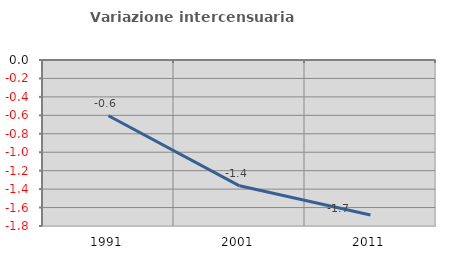
| Category | Variazione intercensuaria annua |
|---|---|
| 1991.0 | -0.605 |
| 2001.0 | -1.365 |
| 2011.0 | -1.681 |